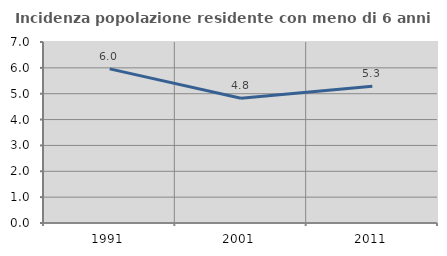
| Category | Incidenza popolazione residente con meno di 6 anni |
|---|---|
| 1991.0 | 5.96 |
| 2001.0 | 4.828 |
| 2011.0 | 5.291 |